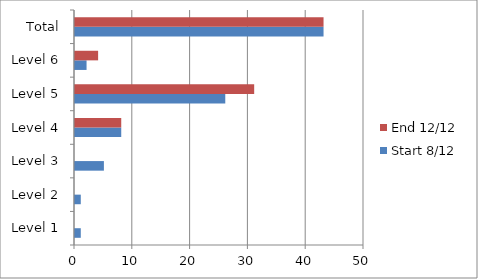
| Category | Start 8/12 | End 12/12 |
|---|---|---|
| Level 1 | 1 | 0 |
| Level 2 | 1 | 0 |
| Level 3 | 5 | 0 |
| Level 4 | 8 | 8 |
| Level 5 | 26 | 31 |
| Level 6 | 2 | 4 |
| Total | 43 | 43 |